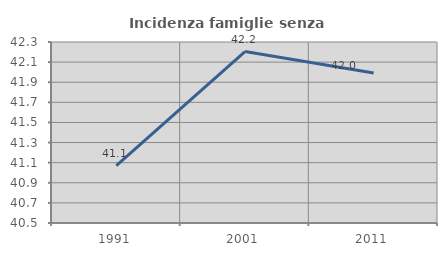
| Category | Incidenza famiglie senza nuclei |
|---|---|
| 1991.0 | 41.071 |
| 2001.0 | 42.205 |
| 2011.0 | 41.992 |